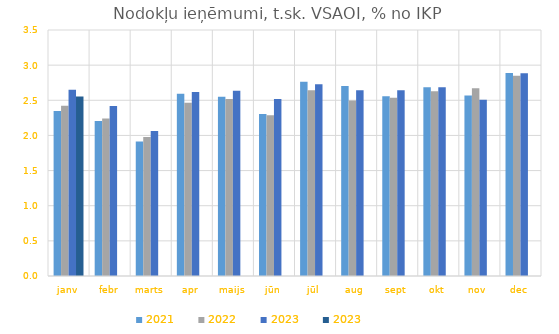
| Category | 2021 | 2022 | 2023 |
|---|---|---|---|
| janv | 2.348 | 2.423 | 2.553 |
| febr | 2.204 | 2.24 | 0 |
| marts | 1.913 | 1.979 | 0 |
| apr | 2.592 | 2.464 | 0 |
| maijs | 2.55 | 2.518 | 0 |
| jūn | 2.305 | 2.287 | 0 |
| jūl | 2.765 | 2.643 | 0 |
| aug | 2.704 | 2.495 | 0 |
| sept | 2.557 | 2.535 | 0 |
| okt | 2.686 | 2.628 | 0 |
| nov | 2.568 | 2.671 | 0 |
| dec | 2.887 | 2.849 | 0 |